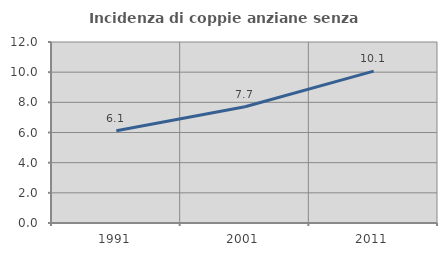
| Category | Incidenza di coppie anziane senza figli  |
|---|---|
| 1991.0 | 6.115 |
| 2001.0 | 7.71 |
| 2011.0 | 10.07 |